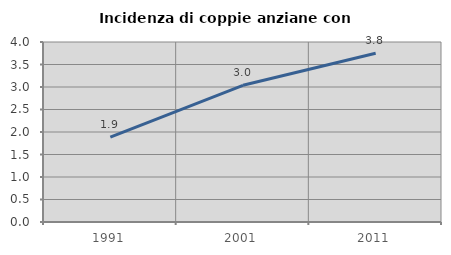
| Category | Incidenza di coppie anziane con figli |
|---|---|
| 1991.0 | 1.887 |
| 2001.0 | 3.037 |
| 2011.0 | 3.751 |